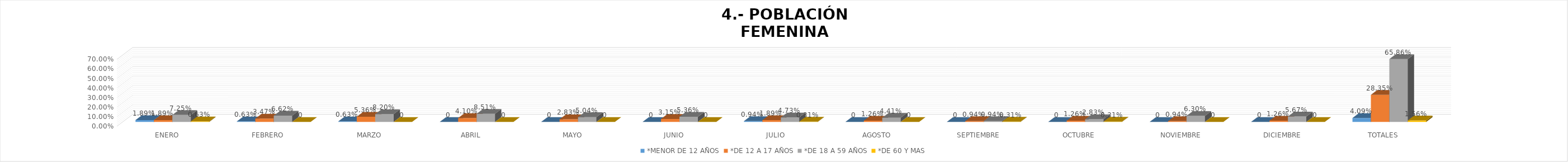
| Category | *MENOR DE 12 AÑOS | *DE 12 A 17 AÑOS | *DE 18 A 59 AÑOS | *DE 60 Y MAS |
|---|---|---|---|---|
| ENERO | 0.019 | 0.019 | 0.072 | 0.006 |
| FEBRERO | 0.006 | 0.035 | 0.066 | 0 |
| MARZO | 0.006 | 0.054 | 0.082 | 0 |
| ABRIL | 0 | 0.041 | 0.085 | 0 |
| MAYO | 0 | 0.028 | 0.05 | 0 |
| JUNIO | 0 | 0.032 | 0.054 | 0 |
| JULIO | 0.009 | 0.019 | 0.047 | 0.003 |
| AGOSTO | 0 | 0.013 | 0.044 | 0 |
| SEPTIEMBRE | 0 | 0.009 | 0.009 | 0.003 |
| OCTUBRE | 0 | 0.013 | 0.028 | 0.003 |
| NOVIEMBRE | 0 | 0.009 | 0.063 | 0 |
| DICIEMBRE | 0 | 0.013 | 0.057 | 0 |
| TOTALES | 0.041 | 0.284 | 0.659 | 0.016 |